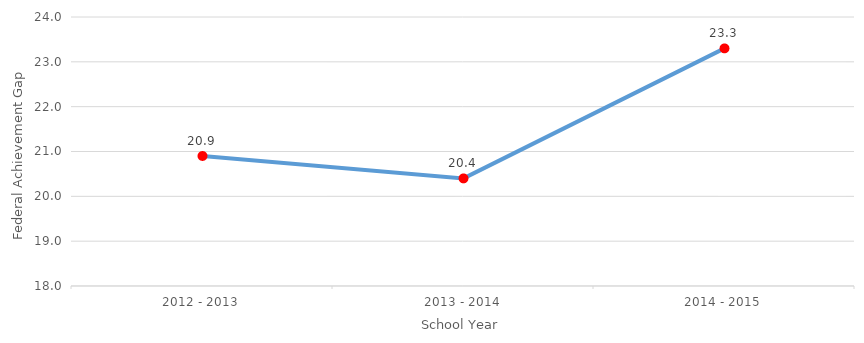
| Category | values |
|---|---|
| 2012 - 2013 | 20.9 |
| 2013 - 2014 | 20.4 |
| 2014 - 2015 | 23.3 |